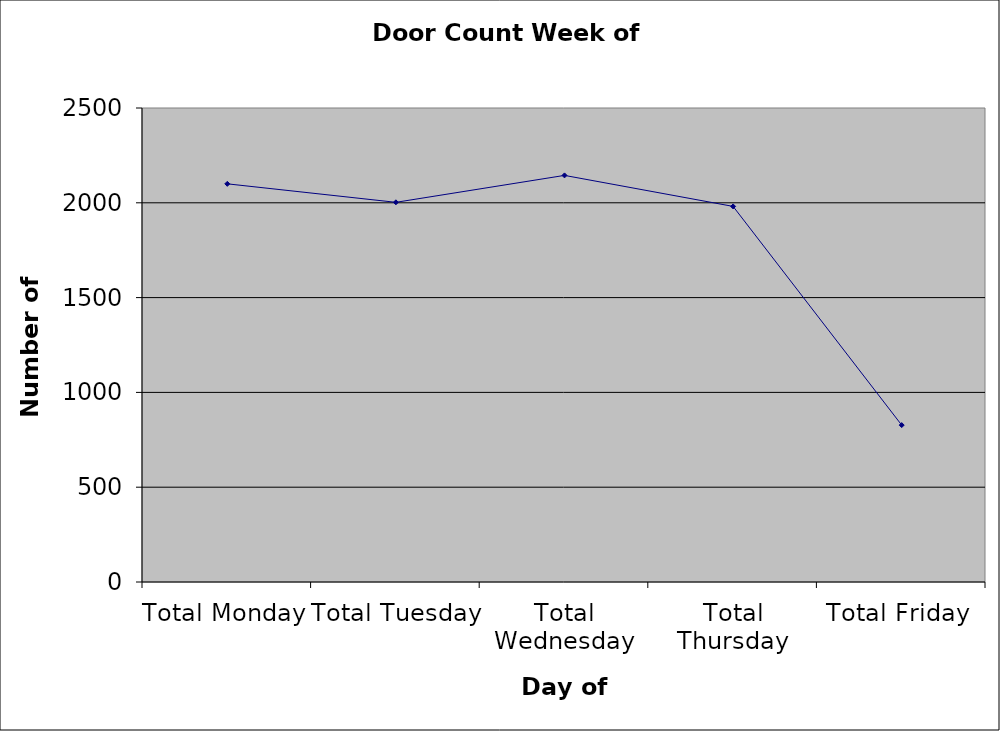
| Category | Series 0 |
|---|---|
| Total Monday | 2100 |
| Total Tuesday | 2002.5 |
| Total Wednesday | 2144.5 |
| Total Thursday | 1981 |
| Total Friday | 827.5 |